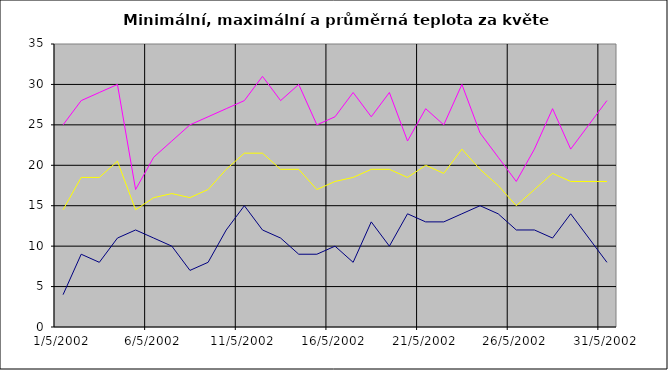
| Category | Series 0 | Series 1 | Series 2 |
|---|---|---|---|
| 2002-05-01 | 4 | 25 | 14.5 |
| 2002-05-02 | 9 | 28 | 18.5 |
| 2002-05-03 | 8 | 29 | 18.5 |
| 2002-05-04 | 11 | 30 | 20.5 |
| 2002-05-05 | 12 | 17 | 14.5 |
| 2002-05-06 | 11 | 21 | 16 |
| 2002-05-07 | 10 | 23 | 16.5 |
| 2002-05-08 | 7 | 25 | 16 |
| 2002-05-09 | 8 | 26 | 17 |
| 2002-05-10 | 12 | 27 | 19.5 |
| 2002-05-11 | 15 | 28 | 21.5 |
| 2002-05-12 | 12 | 31 | 21.5 |
| 2002-05-13 | 11 | 28 | 19.5 |
| 2002-05-14 | 9 | 30 | 19.5 |
| 2002-05-15 | 9 | 25 | 17 |
| 2002-05-16 | 10 | 26 | 18 |
| 2002-05-17 | 8 | 29 | 18.5 |
| 2002-05-18 | 13 | 26 | 19.5 |
| 2002-05-19 | 10 | 29 | 19.5 |
| 2002-05-20 | 14 | 23 | 18.5 |
| 2002-05-21 | 13 | 27 | 20 |
| 2002-05-22 | 13 | 25 | 19 |
| 2002-05-23 | 14 | 30 | 22 |
| 2002-05-24 | 15 | 24 | 19.5 |
| 2002-05-25 | 14 | 21 | 17.5 |
| 2002-05-26 | 12 | 18 | 15 |
| 2002-05-27 | 12 | 22 | 17 |
| 2002-05-28 | 11 | 27 | 19 |
| 2002-05-29 | 14 | 22 | 18 |
| 2002-05-30 | 11 | 25 | 18 |
| 2002-05-31 | 8 | 28 | 18 |